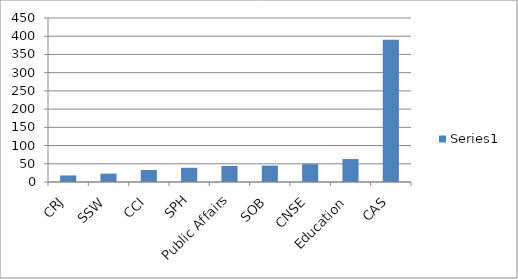
| Category | Series 0 |
|---|---|
| CRJ | 18 |
| SSW | 23 |
| CCI | 33 |
| SPH | 39 |
| Public Affairs | 44 |
| SOB | 45 |
| CNSE | 49 |
| Education | 63 |
| CAS | 390 |